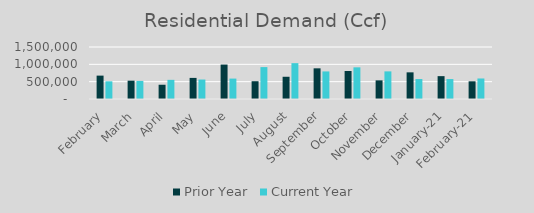
| Category | Prior Year | Current Year |
|---|---|---|
| February | 674439.428 | 510296.309 |
| March | 528549.791 | 521893.674 |
| April | 411179.62 | 552550.404 |
| May | 608563.54 | 561680.927 |
| June | 993563.54 | 588815.728 |
| July | 512849.55 | 920418.723 |
| August | 641515.25 | 1034271.241 |
| September | 884745.885 | 795392.365 |
| October | 808030.57 | 913450.318 |
| November | 537591.016 | 796803.85 |
| December | 768795.205 | 575698.992 |
| January-21 | 659359.876 | 574964.407 |
| February-21 | 510296.309 | 591912.627 |